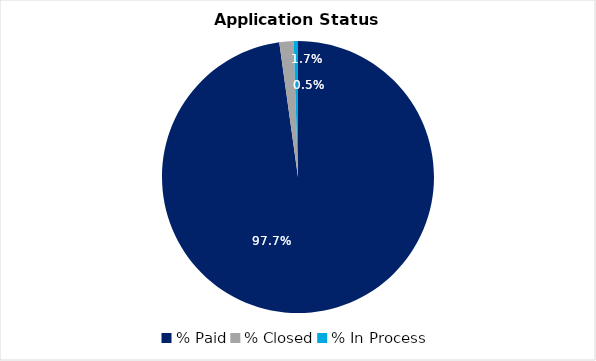
| Category | Series 0 |
|---|---|
| % Paid | 0.977 |
| % Closed | 0.017 |
| % In Process | 0.005 |